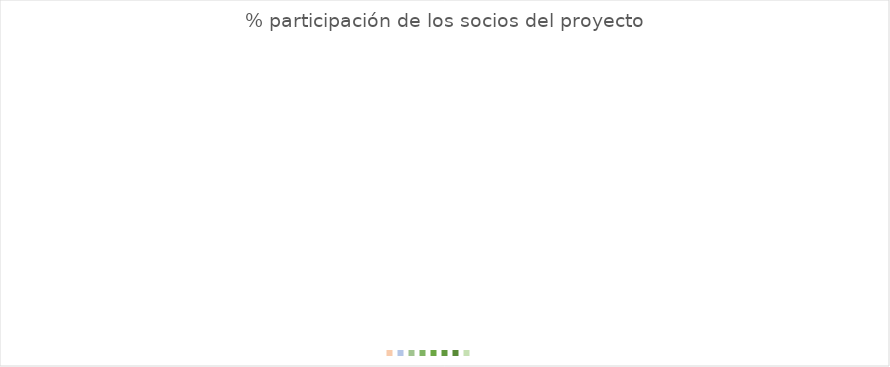
| Category | Series 0 |
|---|---|
|  | 0 |
|  | 0 |
|  | 0 |
|  | 0 |
|  | 0 |
|  | 0 |
|  | 0 |
|  | 0 |